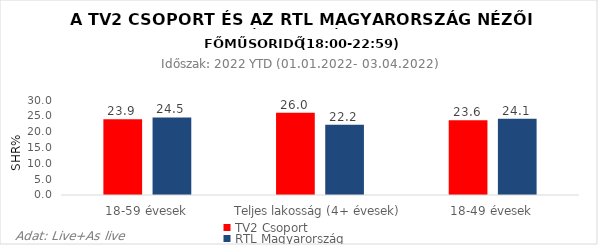
| Category | TV2 Csoport | RTL Magyarország |
|---|---|---|
| 18-59 évesek | 23.9 | 24.5 |
| Teljes lakosság (4+ évesek) | 26 | 22.2 |
| 18-49 évesek | 23.6 | 24.1 |